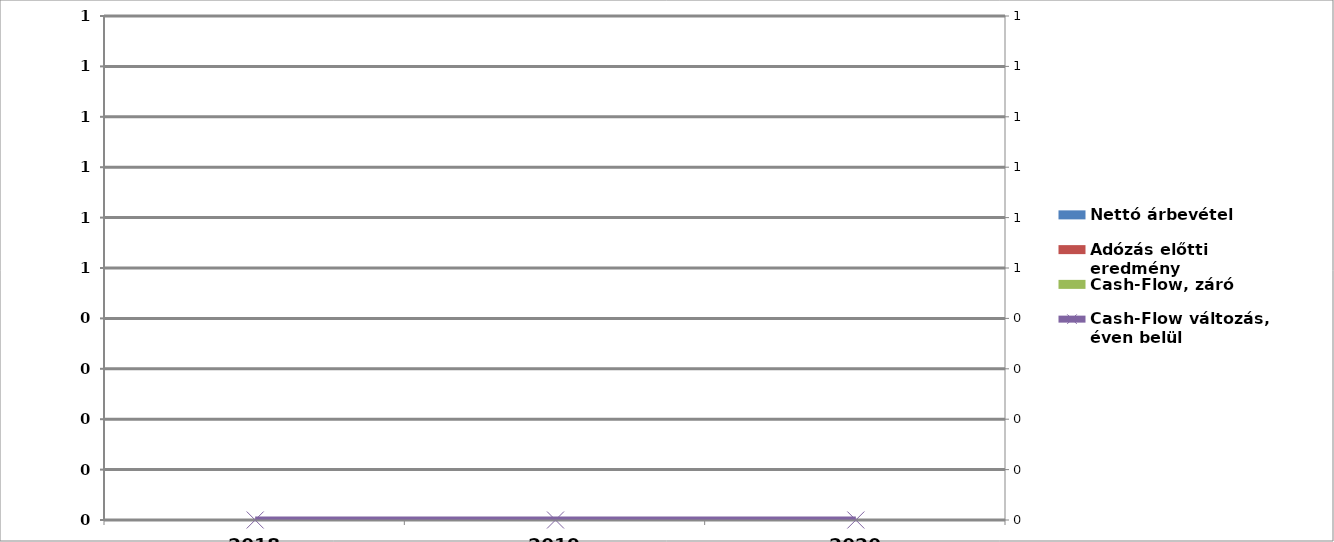
| Category | Nettó árbevétel | Adózás előtti eredmény | Cash-Flow, záró |
|---|---|---|---|
| 0 | 0 | 0 | 0 |
| 1 | 0 | 0 | 0 |
| 2 | 0 | 0 | 0 |